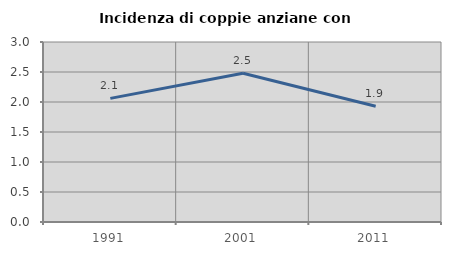
| Category | Incidenza di coppie anziane con figli |
|---|---|
| 1991.0 | 2.061 |
| 2001.0 | 2.48 |
| 2011.0 | 1.929 |